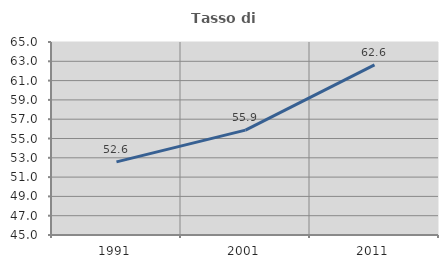
| Category | Tasso di occupazione   |
|---|---|
| 1991.0 | 52.576 |
| 2001.0 | 55.868 |
| 2011.0 | 62.633 |